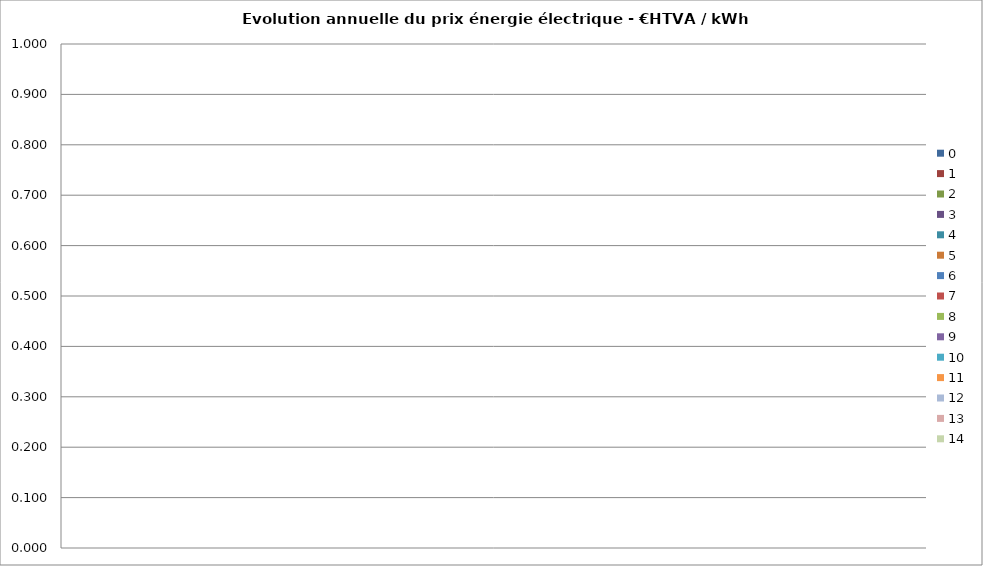
| Category | 0 | 1 | 2 | 3 | 4 | 5 | 6 | 7 | 8 | 9 | 10 | 11 | 12 | 13 | 14 |
|---|---|---|---|---|---|---|---|---|---|---|---|---|---|---|---|
| MOYENNE | 0 | 0 | 0 | 0 | 0 | 0 | 0 | 0 | 0 | 0 | 0 | 0 | 0 | 0 | 0 |